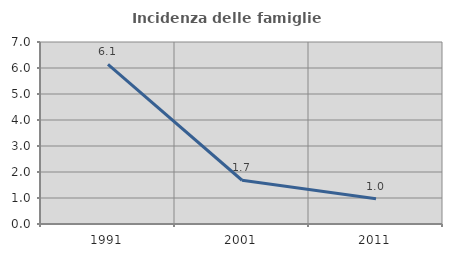
| Category | Incidenza delle famiglie numerose |
|---|---|
| 1991.0 | 6.138 |
| 2001.0 | 1.683 |
| 2011.0 | 0.969 |